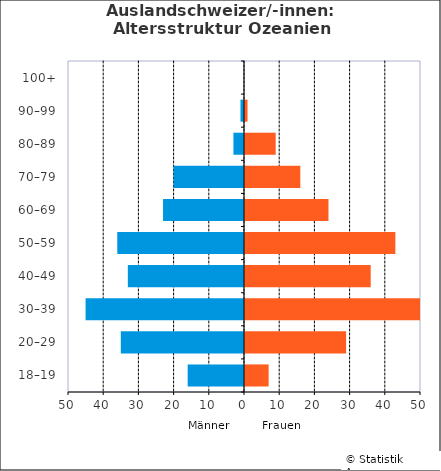
| Category | Männer | Frauen |
|---|---|---|
| 18–19 | -16 | 7 |
| 20–29 | -35 | 29 |
| 30–39 | -45 | 50 |
| 40–49 | -33 | 36 |
| 50–59 | -36 | 43 |
| 60–69 | -23 | 24 |
| 70–79 | -20 | 16 |
| 80–89 | -3 | 9 |
| 90–99 | -1 | 1 |
| 100+ | 0 | 0 |